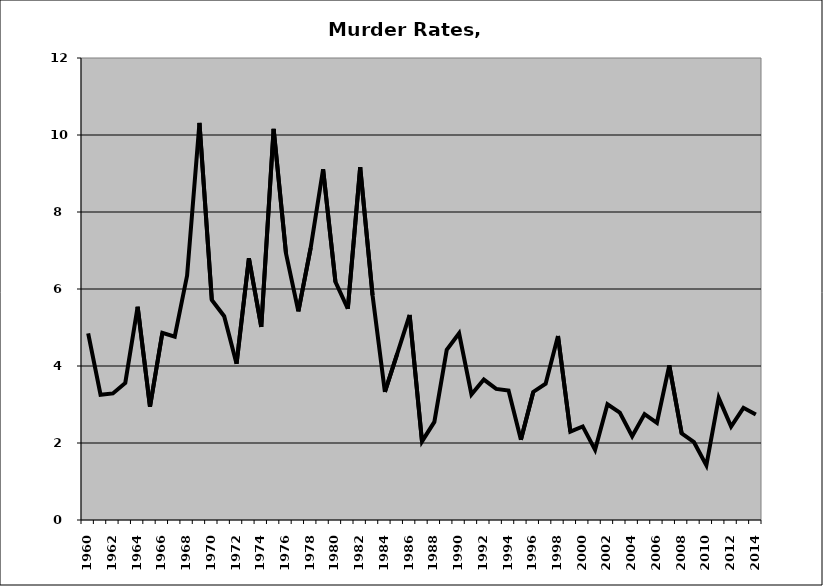
| Category | Murder |
|---|---|
| 1960.0 | 4.848 |
| 1961.0 | 3.254 |
| 1962.0 | 3.288 |
| 1963.0 | 3.561 |
| 1964.0 | 5.539 |
| 1965.0 | 2.941 |
| 1966.0 | 4.863 |
| 1967.0 | 4.762 |
| 1968.0 | 6.349 |
| 1969.0 | 10.312 |
| 1970.0 | 5.716 |
| 1971.0 | 5.294 |
| 1972.0 | 4.058 |
| 1973.0 | 6.799 |
| 1974.0 | 5.014 |
| 1975.0 | 10.16 |
| 1976.0 | 6.923 |
| 1977.0 | 5.419 |
| 1978.0 | 7.075 |
| 1979.0 | 9.111 |
| 1980.0 | 6.184 |
| 1981.0 | 5.488 |
| 1982.0 | 9.163 |
| 1983.0 | 5.837 |
| 1984.0 | 3.327 |
| 1985.0 | 4.322 |
| 1986.0 | 5.325 |
| 1987.0 | 2.041 |
| 1988.0 | 2.548 |
| 1989.0 | 4.421 |
| 1990.0 | 4.85 |
| 1991.0 | 3.261 |
| 1992.0 | 3.648 |
| 1993.0 | 3.404 |
| 1994.0 | 3.361 |
| 1995.0 | 2.083 |
| 1996.0 | 3.326 |
| 1997.0 | 3.542 |
| 1998.0 | 4.782 |
| 1999.0 | 2.294 |
| 2000.0 | 2.43 |
| 2001.0 | 1.823 |
| 2002.0 | 3.007 |
| 2003.0 | 2.788 |
| 2004.0 | 2.174 |
| 2005.0 | 2.752 |
| 2006.0 | 2.524 |
| 2007.0 | 4.017 |
| 2008.0 | 2.251 |
| 2009.0 | 2.021 |
| 2010.0 | 1.419 |
| 2011.0 | 3.173 |
| 2012.0 | 2.428 |
| 2013.0 | 2.915 |
| 2014.0 | 2.739 |